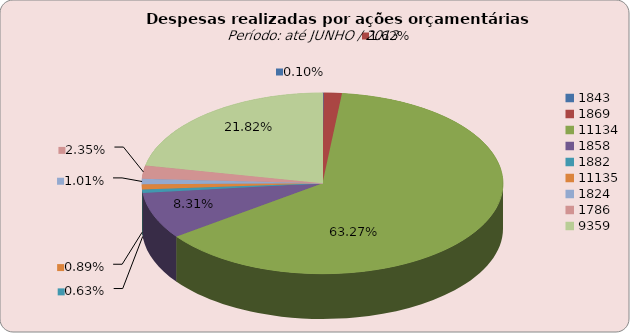
| Category | Series 1 |
|---|---|
| 1843.0 | 81117.02 |
| 1869.0 | 1294529.23 |
| 11134.0 | 50671628.45 |
| 1858.0 | 6658619.61 |
| 1882.0 | 503655.42 |
| 11135.0 | 712167.28 |
| 1824.0 | 806188.23 |
| 1786.0 | 1885819.69 |
| 9359.0 | 17475479.08 |